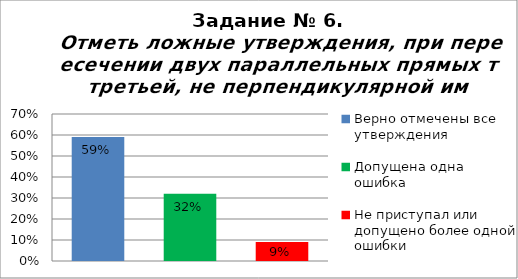
| Category | Отметь ложные утверждения, при пересечении двух параллельных прямых третьей, не перпендикулярной им. |
|---|---|
| Верно отмечены все утверждения | 0.59 |
| Допущена одна ошибка | 0.32 |
| Не приступал или допущено более одной ошибки | 0.09 |